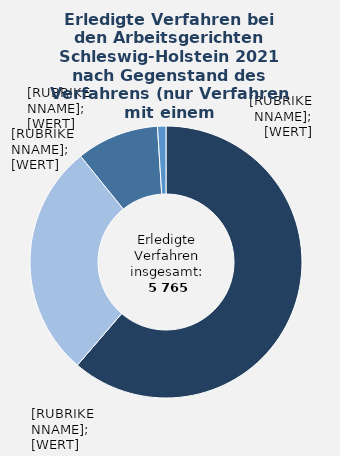
| Category | in Prozent |
|---|---|
| Bestandsstreitigkeiten (insbes. Kündigungen) | 0.613 |
| Zahlungsklagen | 0.279 |
| Sonstiges | 0.098 |
| Tarifliche Eingruppierung | 0.01 |